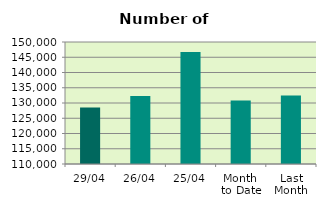
| Category | Series 0 |
|---|---|
| 29/04 | 128538 |
| 26/04 | 132280 |
| 25/04 | 146750 |
| Month 
to Date | 130858.842 |
| Last
Month | 132498.571 |